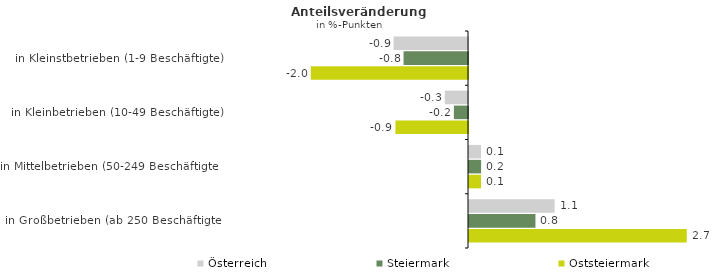
| Category | Österreich | Steiermark | Oststeiermark |
|---|---|---|---|
| in Kleinstbetrieben (1-9 Beschäftigte) | -0.926 | -0.802 | -1.957 |
| in Kleinbetrieben (10-49 Beschäftigte) | -0.289 | -0.176 | -0.903 |
| in Mittelbetrieben (50-249 Beschäftigte) | 0.149 | 0.151 | 0.15 |
| in Großbetrieben (ab 250 Beschäftigte) | 1.066 | 0.827 | 2.71 |